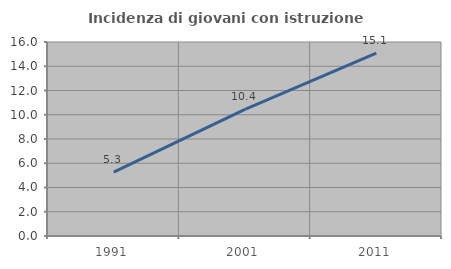
| Category | Incidenza di giovani con istruzione universitaria |
|---|---|
| 1991.0 | 5.263 |
| 2001.0 | 10.448 |
| 2011.0 | 15.084 |